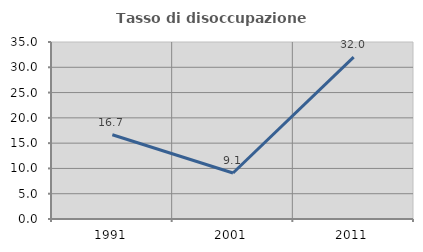
| Category | Tasso di disoccupazione giovanile  |
|---|---|
| 1991.0 | 16.667 |
| 2001.0 | 9.091 |
| 2011.0 | 32 |